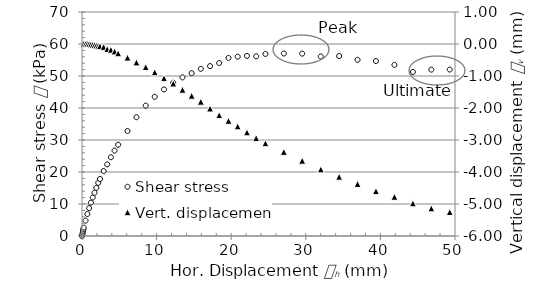
| Category | Shear stress |
|---|---|
| 0.0 | 0 |
| 0.05131999999999992 | 0.553 |
| 0.09621999999999997 | 1.083 |
| 0.13630999999999993 | 1.614 |
| 0.19565 | 2.122 |
| 0.22451999999999994 | 2.608 |
| 0.47630000000000006 | 4.819 |
| 0.7168 | 6.875 |
| 0.9557999999999999 | 8.71 |
| 1.1947 | 10.434 |
| 1.4369 | 12.047 |
| 1.6791 | 13.507 |
| 1.9212000000000002 | 15.054 |
| 2.1746 | 16.602 |
| 2.4135 | 17.818 |
| 2.9027000000000003 | 20.315 |
| 3.379 | 22.393 |
| 3.8745000000000003 | 24.604 |
| 4.3636 | 26.704 |
| 4.8431 | 28.517 |
| 6.0972 | 32.805 |
| 7.3 | 37.116 |
| 8.539599999999998 | 40.742 |
| 9.7486 | 43.505 |
| 10.994599999999998 | 45.804 |
| 12.2296 | 47.882 |
| 13.4676 | 49.562 |
| 14.7006 | 50.889 |
| 15.927599999999998 | 52.237 |
| 17.1646 | 53.099 |
| 18.3906 | 54.049 |
| 19.6356 | 55.641 |
| 20.8716 | 56.039 |
| 22.1146 | 56.282 |
| 23.351599999999998 | 56.15 |
| 24.5896 | 56.901 |
| 27.0546 | 57.034 |
| 29.517599999999998 | 56.989 |
| 32.0096 | 56.105 |
| 34.4676 | 56.238 |
| 36.9396 | 55.066 |
| 39.4006 | 54.668 |
| 41.8806 | 53.475 |
| 44.3576 | 51.264 |
| 46.8256 | 51.994 |
| 49.2956 | 52.015 |